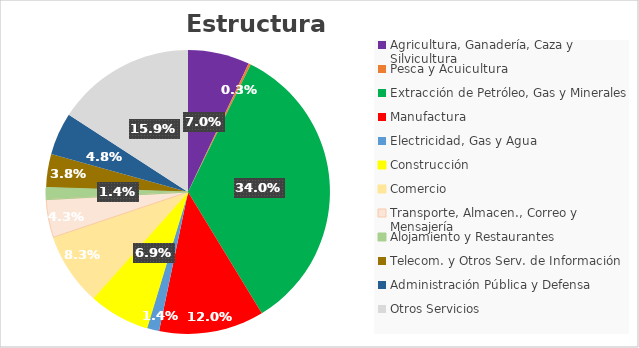
| Category | Series 0 |
|---|---|
| Agricultura, Ganadería, Caza y Silvicultura | 5138053 |
| Pesca y Acuicultura | 190596 |
| Extracción de Petróleo, Gas y Minerales | 24886604 |
| Manufactura | 8751088 |
| Electricidad, Gas y Agua | 1035104 |
| Construcción | 5044283 |
| Comercio | 6044434 |
| Transporte, Almacen., Correo y Mensajería | 3150150 |
| Alojamiento y Restaurantes | 1000078 |
| Telecom. y Otros Serv. de Información | 2790419 |
| Administración Pública y Defensa | 3526282 |
| Otros Servicios | 11598521 |